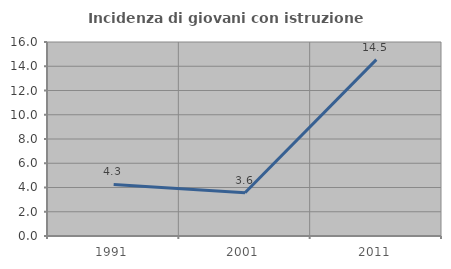
| Category | Incidenza di giovani con istruzione universitaria |
|---|---|
| 1991.0 | 4.255 |
| 2001.0 | 3.571 |
| 2011.0 | 14.545 |